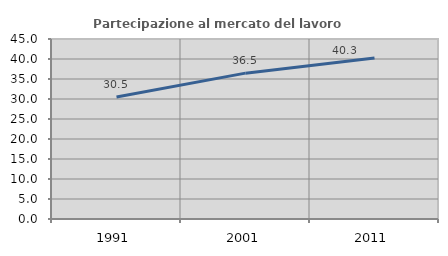
| Category | Partecipazione al mercato del lavoro  femminile |
|---|---|
| 1991.0 | 30.476 |
| 2001.0 | 36.464 |
| 2011.0 | 40.26 |